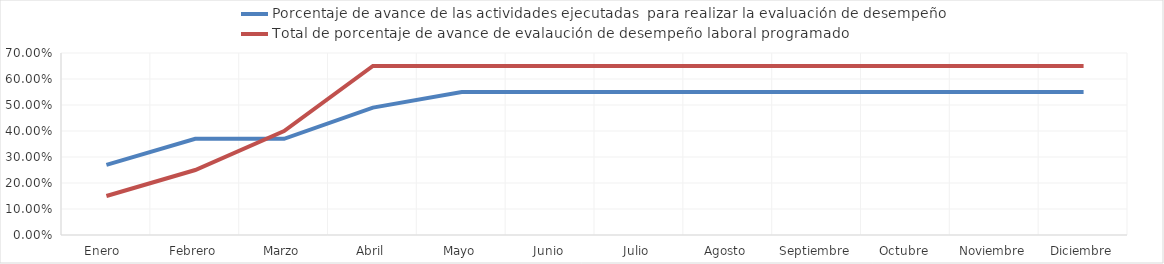
| Category | Porcentaje de avance de las actividades ejecutadas  para realizar la evaluación de desempeño | Total de porcentaje de avance de evalaución de desempeño laboral programado |
|---|---|---|
| Enero  | 0.27 | 0.15 |
| Febrero | 0.37 | 0.25 |
| Marzo | 0.37 | 0.4 |
| Abril | 0.49 | 0.65 |
| Mayo | 0.55 | 0.65 |
| Junio | 0.55 | 0.65 |
| Julio | 0.55 | 0.65 |
| Agosto | 0.55 | 0.65 |
| Septiembre | 0.55 | 0.65 |
| Octubre | 0.55 | 0.65 |
| Noviembre | 0.55 | 0.65 |
| Diciembre | 0.55 | 0.65 |